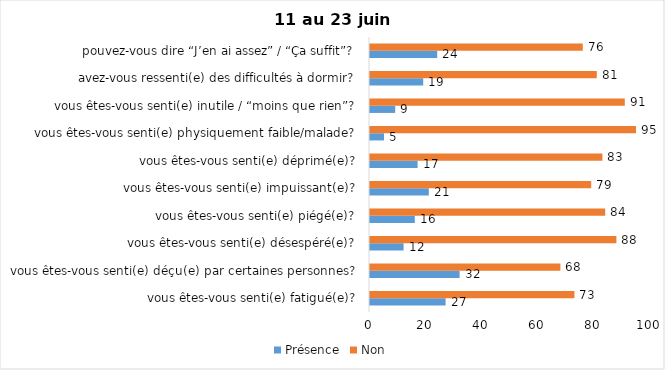
| Category | Présence | Non |
|---|---|---|
| vous êtes-vous senti(e) fatigué(e)? | 27 | 73 |
| vous êtes-vous senti(e) déçu(e) par certaines personnes? | 32 | 68 |
| vous êtes-vous senti(e) désespéré(e)? | 12 | 88 |
| vous êtes-vous senti(e) piégé(e)? | 16 | 84 |
| vous êtes-vous senti(e) impuissant(e)? | 21 | 79 |
| vous êtes-vous senti(e) déprimé(e)? | 17 | 83 |
| vous êtes-vous senti(e) physiquement faible/malade? | 5 | 95 |
| vous êtes-vous senti(e) inutile / “moins que rien”? | 9 | 91 |
| avez-vous ressenti(e) des difficultés à dormir? | 19 | 81 |
| pouvez-vous dire “J’en ai assez” / “Ça suffit”? | 24 | 76 |